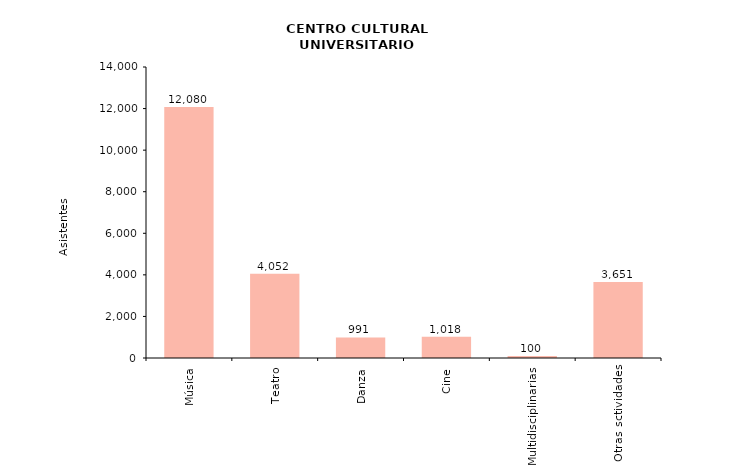
| Category | Series 0 |
|---|---|
| Música | 12080 |
| Teatro | 4052 |
| Danza | 991 |
| Cine | 1018 |
| Multidisciplinarias | 100 |
| Otras sctividades | 3651 |